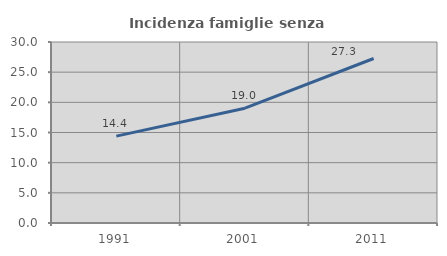
| Category | Incidenza famiglie senza nuclei |
|---|---|
| 1991.0 | 14.404 |
| 2001.0 | 19.029 |
| 2011.0 | 27.264 |